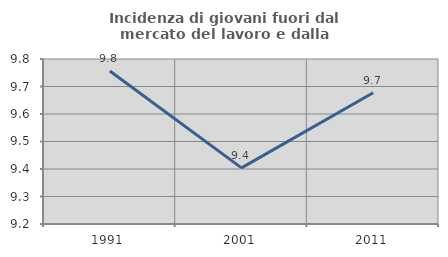
| Category | Incidenza di giovani fuori dal mercato del lavoro e dalla formazione  |
|---|---|
| 1991.0 | 9.756 |
| 2001.0 | 9.404 |
| 2011.0 | 9.677 |